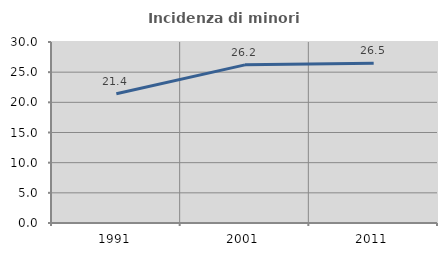
| Category | Incidenza di minori stranieri |
|---|---|
| 1991.0 | 21.429 |
| 2001.0 | 26.214 |
| 2011.0 | 26.48 |